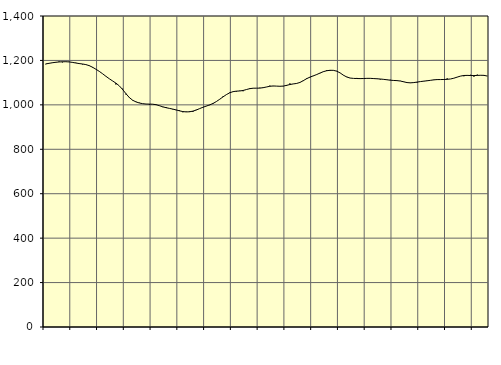
| Category | Piggar | Series 1 |
|---|---|---|
| nan | 1182.7 | 1184.3 |
| 87.0 | 1187.1 | 1186.91 |
| 87.0 | 1188.6 | 1189.51 |
| 87.0 | 1190 | 1191.73 |
| nan | 1195.5 | 1193.1 |
| 88.0 | 1191 | 1193.93 |
| 88.0 | 1195.1 | 1194.16 |
| 88.0 | 1194.6 | 1193.26 |
| nan | 1190.3 | 1191.18 |
| 89.0 | 1189.7 | 1188.4 |
| 89.0 | 1187.2 | 1185.95 |
| 89.0 | 1182.1 | 1183.97 |
| nan | 1182.1 | 1181.3 |
| 90.0 | 1178 | 1176.63 |
| 90.0 | 1167.8 | 1169.41 |
| 90.0 | 1160.9 | 1160.57 |
| nan | 1151.1 | 1150.93 |
| 91.0 | 1140.4 | 1140.17 |
| 91.0 | 1128.3 | 1128.62 |
| 91.0 | 1117.7 | 1117.67 |
| nan | 1107.9 | 1107.63 |
| 92.0 | 1091.7 | 1097.76 |
| 92.0 | 1085.5 | 1085.55 |
| 92.0 | 1072.7 | 1069.04 |
| nan | 1046.5 | 1050.15 |
| 93.0 | 1031.4 | 1032.95 |
| 93.0 | 1021.9 | 1020.77 |
| 93.0 | 1014.2 | 1013.25 |
| nan | 1009.7 | 1008.35 |
| 94.0 | 1005.3 | 1005.34 |
| 94.0 | 1003.9 | 1003.71 |
| 94.0 | 1000.7 | 1003.3 |
| nan | 1002.6 | 1002.94 |
| 95.0 | 1001.9 | 1000.74 |
| 95.0 | 995.6 | 996.22 |
| 95.0 | 989.8 | 991.1 |
| nan | 990.3 | 987.2 |
| 96.0 | 984.4 | 984.09 |
| 96.0 | 979.5 | 980.89 |
| 96.0 | 976.2 | 977.15 |
| nan | 975.5 | 973.08 |
| 97.0 | 966.6 | 969.76 |
| 97.0 | 969.9 | 968.24 |
| 97.0 | 971 | 968.88 |
| nan | 968 | 971.73 |
| 98.0 | 978 | 976.62 |
| 98.0 | 982.7 | 983.06 |
| 98.0 | 988.5 | 989.1 |
| nan | 994.9 | 994.37 |
| 99.0 | 998.6 | 999.72 |
| 99.0 | 1004.2 | 1006.1 |
| 99.0 | 1014.6 | 1014.71 |
| nan | 1025.8 | 1025.08 |
| 0.0 | 1038.1 | 1035.8 |
| 0.0 | 1045.5 | 1046.03 |
| 0.0 | 1055.7 | 1054.19 |
| nan | 1059.8 | 1059.46 |
| 1.0 | 1059.5 | 1061.69 |
| 1.0 | 1063.8 | 1062.46 |
| 1.0 | 1061.3 | 1064.74 |
| nan | 1069.3 | 1068.95 |
| 2.0 | 1075.1 | 1072.89 |
| 2.0 | 1074.7 | 1074.9 |
| 2.0 | 1075.2 | 1075.07 |
| nan | 1077.1 | 1075.33 |
| 3.0 | 1075.8 | 1077.33 |
| 3.0 | 1080.2 | 1080.51 |
| 3.0 | 1086.6 | 1083.68 |
| nan | 1084.2 | 1085.03 |
| 4.0 | 1084.2 | 1084.39 |
| 4.0 | 1083.2 | 1083.67 |
| 4.0 | 1083.6 | 1084.53 |
| nan | 1084.9 | 1087.72 |
| 5.0 | 1096.6 | 1091.55 |
| 5.0 | 1094.6 | 1094.23 |
| 5.0 | 1095.6 | 1096.4 |
| nan | 1100.4 | 1100.92 |
| 6.0 | 1107.1 | 1109 |
| 6.0 | 1120 | 1117.81 |
| 6.0 | 1123.6 | 1124.95 |
| nan | 1129.6 | 1130.61 |
| 7.0 | 1137.1 | 1136.42 |
| 7.0 | 1142.4 | 1143.25 |
| 7.0 | 1150.5 | 1149.44 |
| nan | 1156.5 | 1153.62 |
| 8.0 | 1153.1 | 1155.58 |
| 8.0 | 1156.1 | 1155.31 |
| 8.0 | 1152.8 | 1151.64 |
| nan | 1143.5 | 1143.81 |
| 9.0 | 1134.2 | 1133.49 |
| 9.0 | 1126.5 | 1125.25 |
| 9.0 | 1120.4 | 1120.73 |
| nan | 1119.2 | 1119.13 |
| 10.0 | 1121.2 | 1118.52 |
| 10.0 | 1116.4 | 1118.18 |
| 10.0 | 1117.8 | 1118.57 |
| nan | 1119.7 | 1119.34 |
| 11.0 | 1119.5 | 1119.33 |
| 11.0 | 1119.6 | 1118.42 |
| 11.0 | 1116.4 | 1117.44 |
| nan | 1114.1 | 1116.38 |
| 12.0 | 1114.2 | 1114.8 |
| 12.0 | 1112.2 | 1112.93 |
| 12.0 | 1112.9 | 1111.04 |
| nan | 1108.9 | 1109.79 |
| 13.0 | 1108.9 | 1109.09 |
| 13.0 | 1108 | 1107.31 |
| 13.0 | 1105 | 1103.8 |
| nan | 1100.5 | 1100.35 |
| 14.0 | 1098.2 | 1099.12 |
| 14.0 | 1101.2 | 1100.28 |
| 14.0 | 1100.3 | 1102.49 |
| nan | 1104.6 | 1104.77 |
| 15.0 | 1107.5 | 1106.69 |
| 15.0 | 1107.4 | 1108.43 |
| 15.0 | 1110.7 | 1110.39 |
| nan | 1111.6 | 1112.62 |
| 16.0 | 1114.8 | 1113.74 |
| 16.0 | 1114.4 | 1113.92 |
| 16.0 | 1112.1 | 1114.23 |
| nan | 1119.3 | 1114.88 |
| 17.0 | 1116.5 | 1116.49 |
| 17.0 | 1120.1 | 1119.92 |
| 17.0 | 1124.6 | 1124.97 |
| nan | 1129.3 | 1129.55 |
| 18.0 | 1128.7 | 1132.18 |
| 18.0 | 1130.7 | 1132.66 |
| 18.0 | 1135.4 | 1132.08 |
| nan | 1126.6 | 1131.86 |
| 19.0 | 1136.3 | 1132.5 |
| 19.0 | 1133.8 | 1133.2 |
| 19.0 | 1133.9 | 1132.81 |
| nan | 1130.3 | 1129.67 |